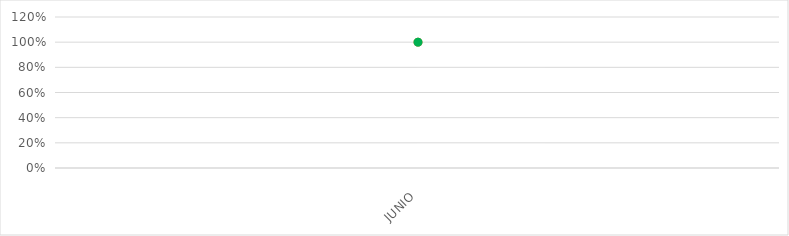
| Category | VALOR  | META PONDERADA |
|---|---|---|
| JUNIO | 1 | 1 |